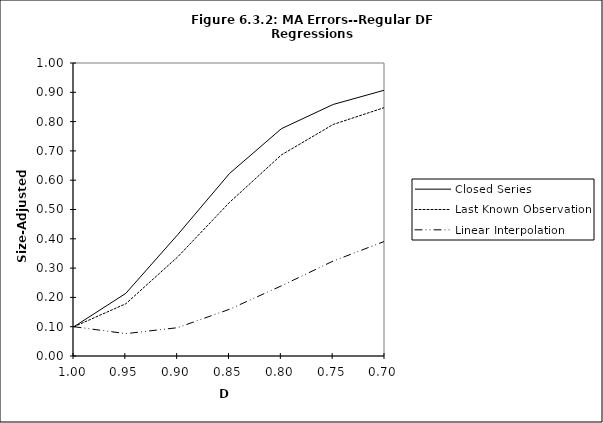
| Category | Closed Series | Last Known Observation | Linear Interpolation |
|---|---|---|---|
| 1.0 | 0.1 | 0.1 | 0.1 |
| 0.95 | 0.214 | 0.178 | 0.076 |
| 0.9 | 0.414 | 0.338 | 0.097 |
| 0.85 | 0.623 | 0.524 | 0.16 |
| 0.8 | 0.776 | 0.686 | 0.239 |
| 0.75 | 0.858 | 0.79 | 0.324 |
| 0.7 | 0.908 | 0.849 | 0.392 |